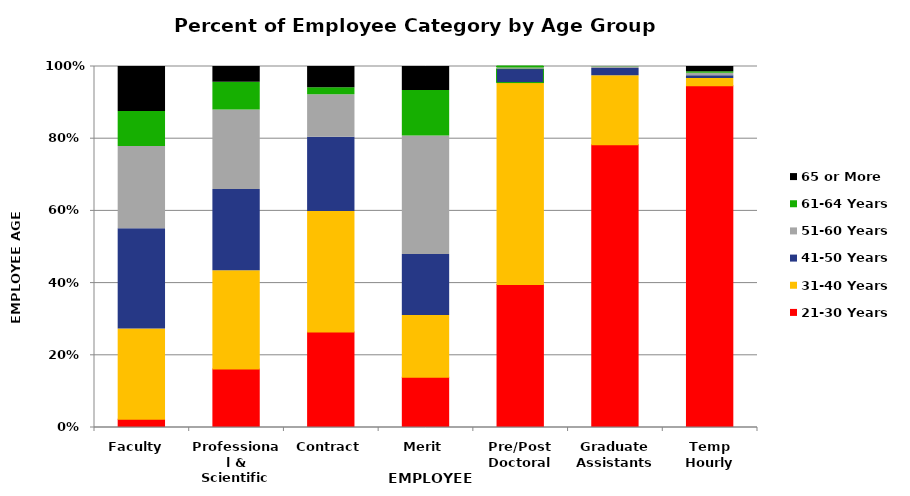
| Category | 21-30 Years | 31-40 Years | 41-50 Years | 51-60 Years | 61-64 Years | 65 or More |
|---|---|---|---|---|---|---|
| Faculty  | 0.023 | 0.249 | 0.278 | 0.227 | 0.097 | 0.125 |
| Professional & Scientific | 0.162 | 0.273 | 0.225 | 0.22 | 0.077 | 0.043 |
| Contract | 0.265 | 0.333 | 0.206 | 0.118 | 0.02 | 0.059 |
| Merit | 0.139 | 0.171 | 0.169 | 0.329 | 0.126 | 0.067 |
| Pre/Post Doctoral | 0.396 | 0.556 | 0.04 | 0.004 | 0.004 | 0 |
| Graduate Assistants | 0.783 | 0.191 | 0.02 | 0.005 | 0 | 0 |
| Temp Hourly | 0.947 | 0.02 | 0.008 | 0.006 | 0.005 | 0.014 |